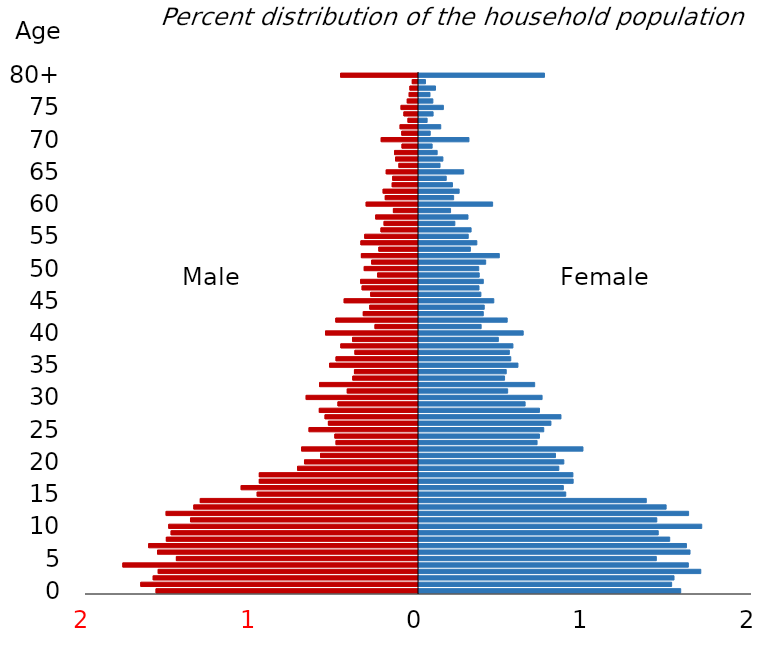
| Category | Male | Female |
|---|---|---|
| 0 | -1.576 | 1.572 |
| 1 | -1.668 | 1.517 |
| 2 | -1.593 | 1.532 |
| 3 | -1.563 | 1.692 |
| 4 | -1.776 | 1.618 |
| 5 | -1.454 | 1.425 |
| 6 | -1.568 | 1.628 |
| 7 | -1.621 | 1.606 |
| 8 | -1.514 | 1.506 |
| 9 | -1.486 | 1.437 |
| 10 | -1.5 | 1.698 |
| 11 | -1.369 | 1.428 |
| 12 | -1.516 | 1.619 |
| 13 | -1.349 | 1.484 |
| 14 | -1.311 | 1.365 |
| 15 | -0.969 | 0.881 |
| 16 | -1.065 | 0.867 |
| 17 | -0.956 | 0.926 |
| 18 | -0.956 | 0.924 |
| 19 | -0.726 | 0.84 |
| 20 | -0.685 | 0.87 |
| 21 | -0.589 | 0.82 |
| 22 | -0.702 | 0.985 |
| 23 | -0.495 | 0.709 |
| 24 | -0.502 | 0.723 |
| 25 | -0.657 | 0.749 |
| 26 | -0.541 | 0.792 |
| 27 | -0.561 | 0.853 |
| 28 | -0.596 | 0.723 |
| 29 | -0.484 | 0.637 |
| 30 | -0.675 | 0.739 |
| 31 | -0.428 | 0.533 |
| 32 | -0.594 | 0.695 |
| 33 | -0.395 | 0.514 |
| 34 | -0.385 | 0.524 |
| 35 | -0.534 | 0.594 |
| 36 | -0.495 | 0.551 |
| 37 | -0.382 | 0.543 |
| 38 | -0.467 | 0.564 |
| 39 | -0.396 | 0.477 |
| 40 | -0.558 | 0.626 |
| 41 | -0.261 | 0.373 |
| 42 | -0.497 | 0.53 |
| 43 | -0.332 | 0.386 |
| 44 | -0.293 | 0.392 |
| 45 | -0.446 | 0.449 |
| 46 | -0.287 | 0.372 |
| 47 | -0.339 | 0.36 |
| 48 | -0.347 | 0.386 |
| 49 | -0.245 | 0.362 |
| 50 | -0.326 | 0.359 |
| 51 | -0.281 | 0.4 |
| 52 | -0.343 | 0.482 |
| 53 | -0.238 | 0.309 |
| 54 | -0.346 | 0.347 |
| 55 | -0.323 | 0.296 |
| 56 | -0.225 | 0.313 |
| 57 | -0.207 | 0.215 |
| 58 | -0.257 | 0.294 |
| 59 | -0.151 | 0.189 |
| 60 | -0.314 | 0.442 |
| 61 | -0.2 | 0.208 |
| 62 | -0.212 | 0.241 |
| 63 | -0.158 | 0.201 |
| 64 | -0.155 | 0.164 |
| 65 | -0.194 | 0.268 |
| 66 | -0.118 | 0.126 |
| 67 | -0.138 | 0.144 |
| 68 | -0.144 | 0.109 |
| 69 | -0.099 | 0.079 |
| 70 | -0.224 | 0.3 |
| 71 | -0.1 | 0.067 |
| 72 | -0.111 | 0.131 |
| 73 | -0.063 | 0.049 |
| 74 | -0.088 | 0.085 |
| 75 | -0.105 | 0.146 |
| 76 | -0.067 | 0.083 |
| 77 | -0.056 | 0.066 |
| 78 | -0.052 | 0.099 |
| 79 | -0.037 | 0.039 |
| 80+ | -0.468 | 0.754 |